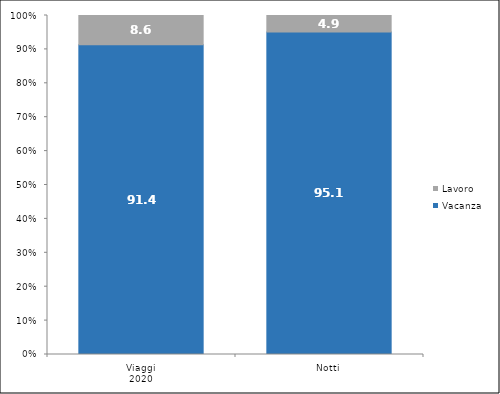
| Category | Vacanza | Lavoro |
|---|---|---|
| 0 | 91.4 | 8.6 |
| 1 | 95.1 | 4.9 |